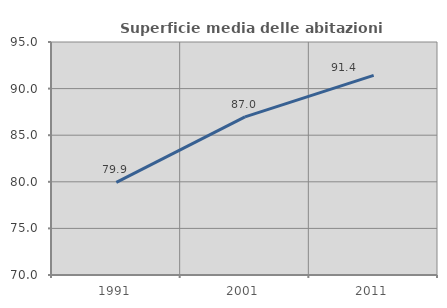
| Category | Superficie media delle abitazioni occupate |
|---|---|
| 1991.0 | 79.935 |
| 2001.0 | 86.96 |
| 2011.0 | 91.413 |